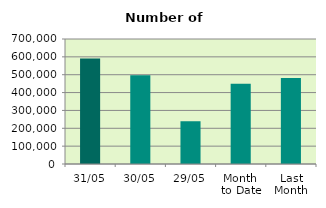
| Category | Series 0 |
|---|---|
| 31/05 | 590628 |
| 30/05 | 496984 |
| 29/05 | 238812 |
| Month 
to Date | 449234.545 |
| Last
Month | 481931.444 |